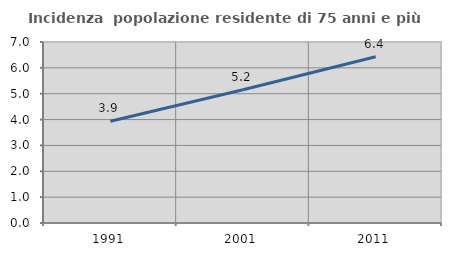
| Category | Incidenza  popolazione residente di 75 anni e più |
|---|---|
| 1991.0 | 3.938 |
| 2001.0 | 5.154 |
| 2011.0 | 6.432 |